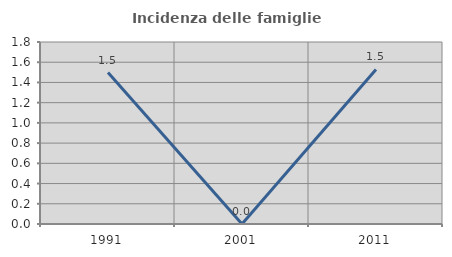
| Category | Incidenza delle famiglie numerose |
|---|---|
| 1991.0 | 1.498 |
| 2001.0 | 0 |
| 2011.0 | 1.529 |